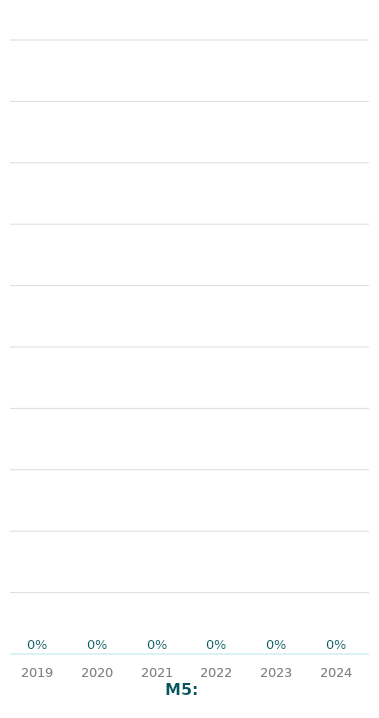
| Category | Series 0 |
|---|---|
| 2019.0 | 0 |
| 2020.0 | 0 |
| 2021.0 | 0 |
| 2022.0 | 0 |
| 2023.0 | 0 |
| 2024.0 | 0 |